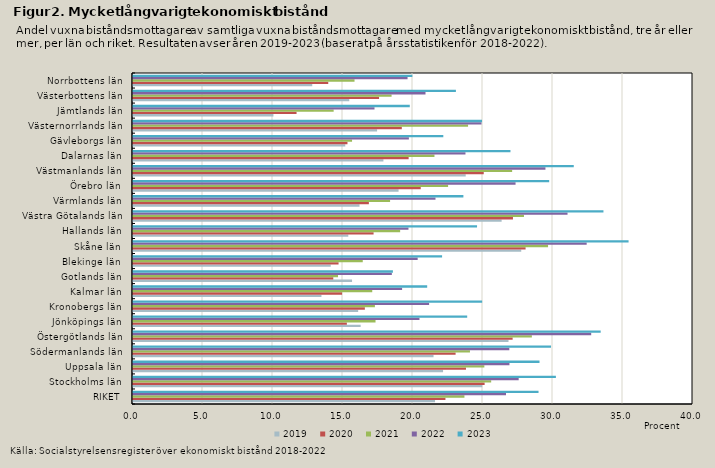
| Category | 2019 | 2020 | 2021 | 2022 | 2023 |
|---|---|---|---|---|---|
| RIKET | 21.574 | 22.317 | 23.674 | 26.643 | 28.967 |
| Stockholms län | 24.949 | 25.116 | 25.584 | 27.548 | 30.207 |
| Uppsala län | 22.147 | 23.783 | 25.097 | 26.89 | 29.036 |
| Södermanlands län | 21.467 | 23.043 | 24.068 | 26.88 | 29.859 |
| Östergötlands län | 26.822 | 27.116 | 28.489 | 32.728 | 33.406 |
| Jönköpings län | 16.262 | 15.275 | 17.324 | 20.461 | 23.871 |
| Kronobergs län | 16.083 | 16.561 | 17.278 | 21.15 | 24.94 |
| Kalmar län | 13.46 | 14.934 | 17.089 | 19.222 | 21.013 |
| Gotlands län | 15.646 | 14.306 | 14.644 | 18.488 | 18.565 |
| Blekinge län | 14.124 | 14.683 | 16.41 | 20.334 | 22.077 |
| Skåne län | 27.731 | 28.041 | 29.647 | 32.406 | 35.398 |
| Hallands län | 15.378 | 17.185 | 19.081 | 19.676 | 24.575 |
| Västra Götalands län | 26.331 | 27.14 | 27.926 | 31.038 | 33.604 |
| Värmlands län | 16.18 | 16.848 | 18.362 | 21.607 | 23.599 |
| Örebro län | 18.969 | 20.553 | 22.507 | 27.325 | 29.727 |
| Västmanlands län | 23.766 | 25.053 | 27.081 | 29.461 | 31.483 |
| Dalarnas län | 17.886 | 19.688 | 21.533 | 23.748 | 26.962 |
| Gävleborgs län | 15.163 | 15.32 | 15.647 | 19.706 | 22.165 |
| Västernorrlands län | 17.435 | 19.2 | 23.933 | 24.892 | 24.931 |
| Jämtlands län | 10.032 | 11.682 | 14.332 | 17.25 | 19.77 |
| Västerbottens län | 15.448 | 17.576 | 18.47 | 20.893 | 23.065 |
| Norrbottens län | 12.803 | 13.946 | 15.824 | 19.61 | 19.955 |